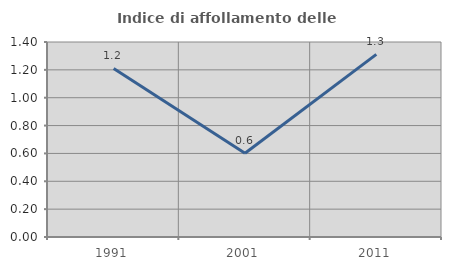
| Category | Indice di affollamento delle abitazioni  |
|---|---|
| 1991.0 | 1.21 |
| 2001.0 | 0.601 |
| 2011.0 | 1.311 |